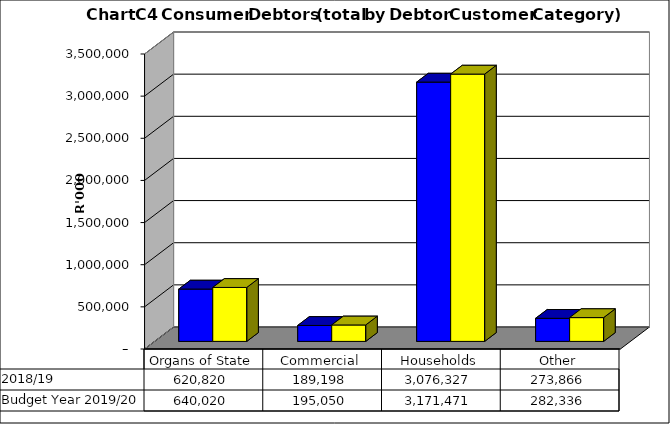
| Category |  2018/19  | Budget Year 2019/20 |
|---|---|---|
| Organs of State | 620819543.676 | 640020148.12 |
| Commercial | 189198247.237 | 195049739.42 |
| Households | 3076326692.121 | 3171470816.62 |
| Other | 273865928.972 | 282336009.25 |